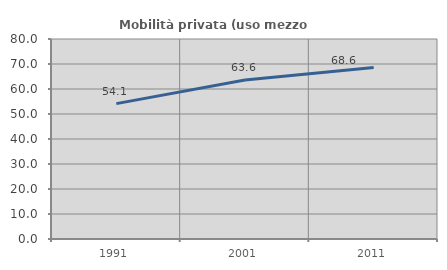
| Category | Mobilità privata (uso mezzo privato) |
|---|---|
| 1991.0 | 54.143 |
| 2001.0 | 63.59 |
| 2011.0 | 68.644 |